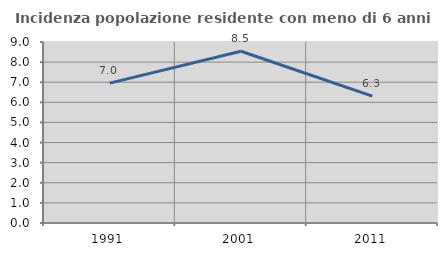
| Category | Incidenza popolazione residente con meno di 6 anni |
|---|---|
| 1991.0 | 6.955 |
| 2001.0 | 8.539 |
| 2011.0 | 6.31 |